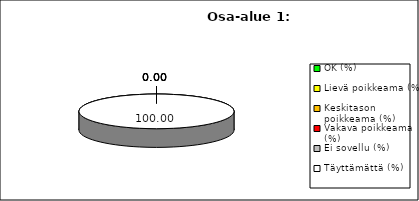
| Category | Series 0 |
|---|---|
| OK (%) | 0 |
| Lievä poikkeama (%) | 0 |
| Keskitason poikkeama (%) | 0 |
| Vakava poikkeama (%) | 0 |
| Ei sovellu (%) | 0 |
| Täyttämättä (%) | 100 |